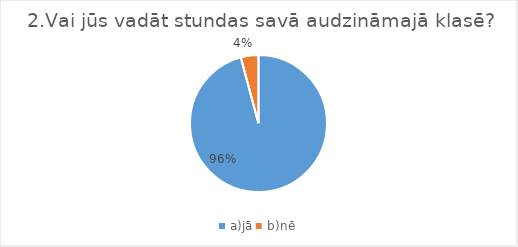
| Category | Series 0 |
|---|---|
| a)jā | 0.958 |
| b)nē | 0.042 |